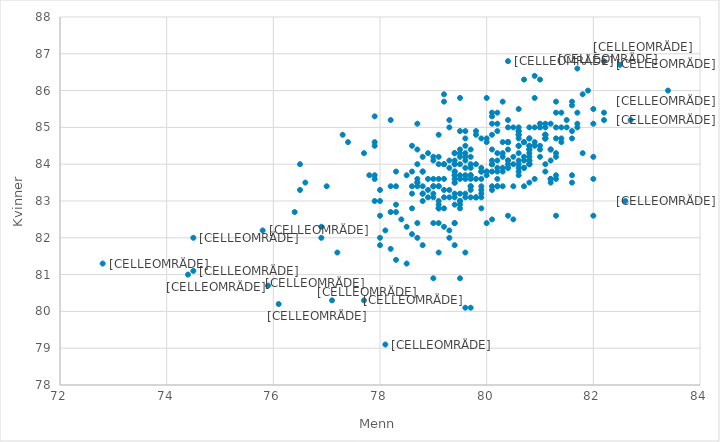
| Category | Kvinner |
|---|---|
| 80.0 | 83.8 |
| 79.2 | 83.6 |
| 79.1 | 83.4 |
| 79.3 | 83.3 |
| 79.8 | 83.1 |
| 79.5 | 83.7 |
| 81.2 | 84.1 |
| 79.7 | 83.1 |
| 81.6 | 83.5 |
| 81.3 | 82.6 |
| 80.9 | 84.6 |
| 79.4 | 83.1 |
| 79.7 | 83.7 |
| 78.7 | 83.5 |
| 80.3 | 84.3 |
| 80.4 | 83.9 |
| 81.1 | 84.8 |
| 81.4 | 84.7 |
| 81.7 | 85.1 |
| 81.3 | 83.7 |
| 81.6 | 84.9 |
| 82.0 | 85.1 |
| 81.4 | 84.6 |
| 79.5 | 83 |
| 80.4 | 84.1 |
| 79.6 | 84.7 |
| 81.1 | 84 |
| 80.5 | 84.2 |
| 80.6 | 84.5 |
| 81.2 | 83.6 |
| 80.1 | 83.4 |
| 79.4 | 83.6 |
| 79.0 | 83.2 |
| 79.7 | 83.9 |
| 79.2 | 84 |
| 80.8 | 84.5 |
| 76.9 | 82.3 |
| 81.3 | 83.6 |
| 80.0 | 85.8 |
| 83.4 | 86 |
| 80.2 | 84.9 |
| 80.6 | 84.9 |
| 81.6 | 83.7 |
| 77.8 | 83.7 |
| 79.4 | 84 |
| 79.9 | 83.6 |
| 80.2 | 83.9 |
| 81.3 | 84.3 |
| 81.7 | 86.6 |
| 79.2 | 85.9 |
| 79.9 | 82.8 |
| 80.0 | 83.7 |
| 78.6 | 82.1 |
| 80.4 | 84 |
| 80.7 | 84.2 |
| 79.7 | 83.3 |
| 79.4 | 83.7 |
| 78.6 | 83.8 |
| 79.4 | 83.8 |
| 78.3 | 81.4 |
| 79.2 | 82.3 |
| 78.1 | 82.2 |
| 78.4 | 82.5 |
| 78.2 | 82.7 |
| 78.2 | 81.7 |
| 79.7 | 83.4 |
| 79.6 | 83.2 |
| 78.3 | 83.4 |
| 77.0 | 83.4 |
| 79.4 | 81.8 |
| 78.2 | 85.2 |
| 78.7 | 83.5 |
| 79.7 | 84.2 |
| 80.1 | 84 |
| 79.3 | 83.9 |
| 80.3 | 83.8 |
| 79.0 | 84.1 |
| 80.8 | 84 |
| 80.6 | 84.8 |
| 81.2 | 83.5 |
| 79.4 | 83.8 |
| 79.9 | 83.1 |
| 80.7 | 84.1 |
| 79.6 | 83.7 |
| 80.9 | 83.6 |
| 80.1 | 83.8 |
| 80.8 | 84.2 |
| 79.7 | 83.4 |
| 79.9 | 83.4 |
| 78.8 | 83.2 |
| 78.5 | 81.3 |
| 78.0 | 81.8 |
| 78.9 | 83.6 |
| 77.2 | 81.6 |
| 79.1 | 82.8 |
| 78.6 | 83.4 |
| 79.5 | 84.4 |
| 79.5 | 80.9 |
| 79.2 | 83.3 |
| 79.7 | 83.6 |
| 80.2 | 83.4 |
| 79.9 | 83.9 |
| 80.1 | 84 |
| 79.1 | 82.9 |
| 79.9 | 83.2 |
| 79.1 | 83.4 |
| 80.6 | 84 |
| 80.7 | 83.9 |
| 79.5 | 83 |
| 78.9 | 83.3 |
| 79.5 | 82.8 |
| 78.8 | 83.8 |
| 80.1 | 83.3 |
| 78.6 | 83.2 |
| 79.5 | 85.8 |
| 78.8 | 83.4 |
| 79.1 | 84.8 |
| 81.8 | 84.3 |
| 79.0 | 80.9 |
| 78.8 | 83.2 |
| 79.5 | 84.9 |
| 78.0 | 83.3 |
| 80.1 | 84.4 |
| 79.5 | 83.2 |
| 80.2 | 83.8 |
| 79.4 | 84 |
| 79.5 | 84.2 |
| 79.7 | 83.7 |
| 79.1 | 83.6 |
| 79.3 | 82 |
| 79.0 | 82.4 |
| 79.4 | 83.2 |
| 81.2 | 84.4 |
| 80.3 | 84.6 |
| 79.6 | 81.6 |
| 79.6 | 80.1 |
| 79.4 | 82.4 |
| 79.7 | 80.1 |
| 77.9 | 84.5 |
| 80.7 | 86.3 |
| 79.6 | 83.9 |
| 79.0 | 83.6 |
| 79.0 | 84.2 |
| 78.5 | 83.7 |
| 77.4 | 84.6 |
| 80.8 | 84.1 |
| 79.7 | 84 |
| 80.4 | 84.1 |
| 79.4 | 83.5 |
| 80.8 | 84.3 |
| 79.5 | 84 |
| 79.4 | 83.7 |
| 80.2 | 83.4 |
| 80.6 | 85 |
| 81.6 | 84.7 |
| 81.1 | 84.7 |
| 80.2 | 83.6 |
| 81.3 | 84.7 |
| 80.9 | 85.8 |
| 80.5 | 85 |
| 79.8 | 84 |
| 80.0 | 84.6 |
| 78.3 | 82.7 |
| 82.2 | 86.8 |
| 81.1 | 84.7 |
| 79.7 | 84.4 |
| 81.1 | 84.7 |
| 80.2 | 84.1 |
| 79.6 | 84.1 |
| 80.5 | 84 |
| 80.1 | 85.1 |
| 80.8 | 85 |
| 80.4 | 85 |
| 80.2 | 85.4 |
| 82.0 | 85.5 |
| 80.8 | 84.4 |
| 78.7 | 84 |
| 77.9 | 83.7 |
| 79.0 | 83.4 |
| 80.1 | 85.4 |
| 81.9 | 86 |
| 80.6 | 84.9 |
| 81.2 | 85.1 |
| 80.6 | 84.7 |
| 80.4 | 84.6 |
| 80.8 | 84.4 |
| 78.7 | 83.6 |
| 81.0 | 85.1 |
| 81.7 | 85.4 |
| 79.3 | 85.2 |
| 81.4 | 85 |
| 80.8 | 84.1 |
| 82.0 | 82.6 |
| 81.0 | 86.3 |
| 79.3 | 85 |
| 80.4 | 86.8 |
| 80.9 | 85 |
| 78.7 | 85.1 |
| 81.2 | 83.6 |
| 79.5 | 82.9 |
| 81.5 | 85.2 |
| 79.6 | 84.5 |
| 80.4 | 84.4 |
| 81.4 | 85.4 |
| 80.2 | 85.1 |
| 81.1 | 83.8 |
| 80.9 | 86.4 |
| 81.1 | 85.1 |
| 79.2 | 83.1 |
| 81.0 | 85 |
| 81.0 | 84.4 |
| 80.4 | 84.6 |
| 80.8 | 84.5 |
| 80.3 | 85.7 |
| 81.3 | 85 |
| 79.8 | 84.8 |
| 80.1 | 85.3 |
| 81.6 | 85.6 |
| 81.3 | 85.7 |
| 81.2 | 84.4 |
| 82.2 | 85.2 |
| 79.4 | 83.5 |
| 81.5 | 85 |
| 81.8 | 85.9 |
| 81.0 | 84.2 |
| 80.6 | 85.5 |
| 80.7 | 84.6 |
| 79.4 | 84.3 |
| 80.1 | 84.1 |
| 78.9 | 83.1 |
| 81.1 | 84.8 |
| 81.6 | 85.7 |
| 79.9 | 84.7 |
| 80.2 | 84.3 |
| 80.6 | 84.1 |
| 80.3 | 83.4 |
| 80.0 | 83.8 |
| 79.6 | 83.6 |
| 82.6 | 83 |
| 80.6 | 84.3 |
| 82.0 | 83.6 |
| 80.5 | 83.4 |
| 80.7 | 83.4 |
| 80.6 | 83.8 |
| 80.8 | 84.7 |
| 81.3 | 84.2 |
| 82.2 | 85.4 |
| 80.0 | 84.7 |
| 81.3 | 85.4 |
| 79.0 | 83.4 |
| 81.1 | 85 |
| 81.1 | 84.8 |
| 80.6 | 83.9 |
| 79.1 | 84 |
| 82.0 | 84.2 |
| 76.5 | 84 |
| 79.4 | 84.1 |
| 80.1 | 84.8 |
| 82.5 | 86.7 |
| 80.8 | 84 |
| 81.7 | 85 |
| 80.6 | 84.8 |
| 79.6 | 84.9 |
| 80.7 | 84.6 |
| 79.1 | 83 |
| 79.3 | 84.1 |
| 79.8 | 83.6 |
| 80.7 | 83.9 |
| 79.8 | 83.1 |
| 82.7 | 85.2 |
| 80.8 | 84 |
| 79.9 | 83.8 |
| 79.1 | 82.8 |
| 80.1 | 84 |
| 80.6 | 83.7 |
| 79.4 | 82.4 |
| 78.5 | 82.3 |
| 79.3 | 83.1 |
| 79.6 | 84.3 |
| 80.1 | 82.5 |
| 80.5 | 82.5 |
| 80.4 | 85.2 |
| 80.4 | 82.6 |
| 79.2 | 85.7 |
| 79.8 | 84.9 |
| 79.9 | 83.8 |
| 78.9 | 84.3 |
| 78.7 | 84.4 |
| 79.9 | 83.3 |
| 78.0 | 82 |
| 76.5 | 83.3 |
| 77.9 | 84.6 |
| 79.6 | 84.2 |
| 78.3 | 82.9 |
| 77.3 | 84.8 |
| 80.3 | 83.9 |
| 80.0 | 82.4 |
| 77.7 | 84.3 |
| 80.8 | 84.7 |
| 78.3 | 83.8 |
| 79.2 | 84 |
| 79.4 | 82.9 |
| 79.1 | 84.2 |
| 79.0 | 83.1 |
| 79.5 | 84.3 |
| 78.8 | 83 |
| 79.1 | 81.6 |
| 78.7 | 83.4 |
| 80.6 | 84.5 |
| 81.0 | 84.5 |
| 79.6 | 83.1 |
| 74.5 | 81.1 |
| 77.9 | 83.6 |
| 78.0 | 83 |
| 79.3 | 82.2 |
| 80.4 | 83.9 |
| 78.2 | 83.4 |
| 80.9 | 84.5 |
| 80.3 | 84.2 |
| 80.4 | 84.6 |
| 79.2 | 82.8 |
| 80.8 | 83.5 |
| 79.4 | 84.3 |
| 79.1 | 82.4 |
| 79.5 | 83.6 |
| 78.7 | 82.4 |
| 78.6 | 84.5 |
| 78.8 | 84.2 |
| 78.8 | 81.8 |
| 76.4 | 82.7 |
| 78.6 | 82.8 |
| 77.9 | 83 |
| 75.8 | 82.2 |
| 76.6 | 83.5 |
| 77.1 | 80.3 |
| 72.8 | 81.3 |
| 75.9 | 80.7 |
| 76.1 | 80.2 |
| 77.7 | 80.3 |
| 77.9 | 85.3 |
| 74.5 | 82 |
| 74.4 | 81 |
| 78.1 | 79.1 |
| 76.9 | 82 |
| 78.7 | 82 |
| 78.0 | 82.6 |
| 78.8 | 83.8 |